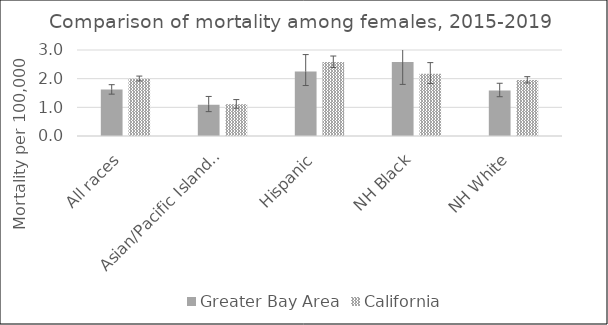
| Category | Greater Bay Area | California | US Mortality |
|---|---|---|---|
| All races | 1.62 | 2 |  |
| Asian/Pacific Islander | 1.09 | 1.11 |  |
| Hispanic | 2.25 | 2.58 |  |
| NH Black | 2.58 | 2.17 |  |
| NH White | 1.59 | 1.95 |  |